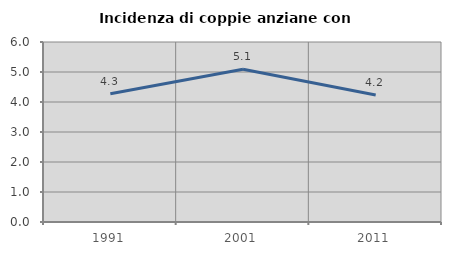
| Category | Incidenza di coppie anziane con figli |
|---|---|
| 1991.0 | 4.274 |
| 2001.0 | 5.093 |
| 2011.0 | 4.231 |